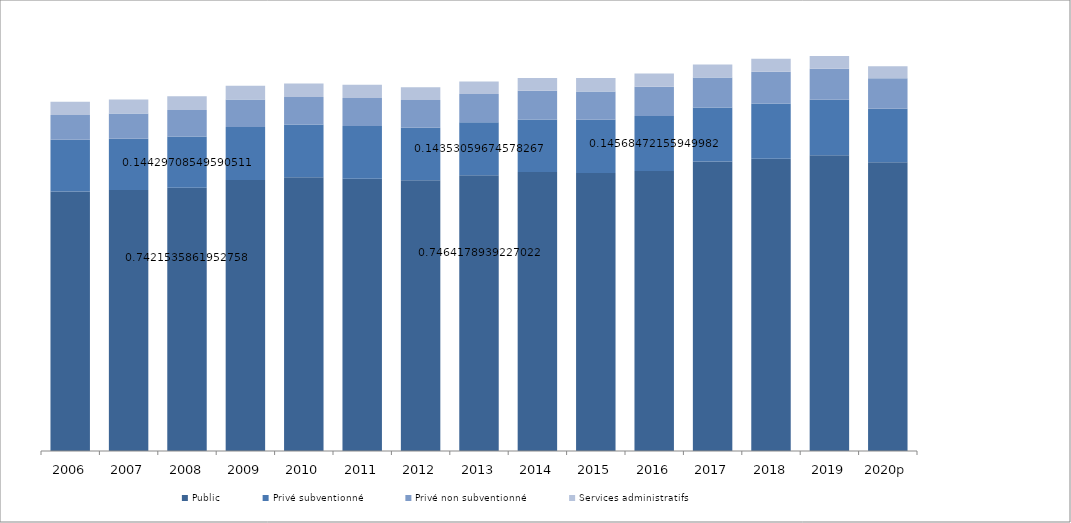
| Category | Public | Privé subventionné | Privé non subventionné | Services administratifs  |
|---|---|---|---|---|
| 2006 | 104.037 | 20.741 | 9.892 | 5.323 |
| 2007 | 104.636 | 20.52 | 10.122 | 5.615 |
| 2008 | 105.523 | 20.517 | 10.67 | 5.475 |
| 2009 | 108.609 | 21.232 | 11.1 | 5.457 |
| 2010 | 109.708 | 21.225 | 10.983 | 5.404 |
| 2011 | 109.176 | 21.137 | 11.188 | 5.353 |
| 2012 | 108.59 | 20.987 | 11.126 | 5.105 |
| 2013 | 110.564 | 21.261 | 11.291 | 5.01 |
| 2014 | 111.824 | 21.098 | 11.455 | 5.121 |
| 2015 | 111.466 | 21.336 | 11.358 | 5.328 |
| 2016 | 112.234 | 22.04 | 11.766 | 5.248 |
| 2017 | 116.088 | 21.656 | 12.011 | 5.169 |
| 2018 | 117.148 | 22.185 | 12.719 | 5.15 |
| 2019 | 118.606 | 22.251 | 12.393 | 5.084 |
| 2020p | 115.778 | 21.403 | 12.256 | 4.834 |